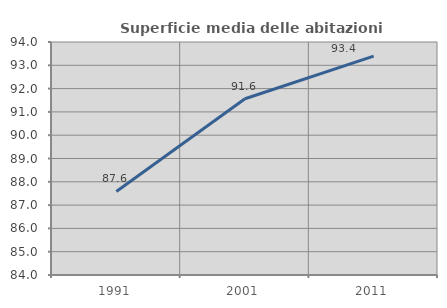
| Category | Superficie media delle abitazioni occupate |
|---|---|
| 1991.0 | 87.585 |
| 2001.0 | 91.566 |
| 2011.0 | 93.394 |